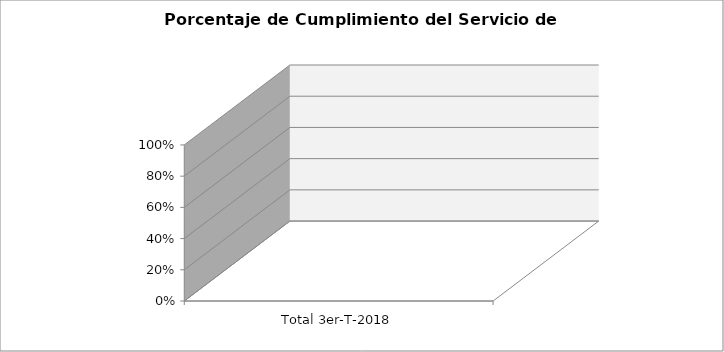
| Category | Total 3er-T-2018 |
|---|---|
| Total 3er-T-2018 | 0 |